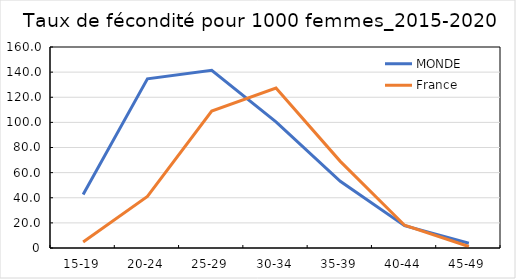
| Category | MONDE | France |
|---|---|---|
| 15-19 | 42.537 | 4.727 |
| 20-24 | 134.695 | 41.036 |
| 25-29 | 141.421 | 109.034 |
| 30-34 | 100.357 | 127.334 |
| 35-39 | 53.065 | 68.969 |
| 40-44 | 17.766 | 18.152 |
| 45-49 | 3.781 | 1.208 |